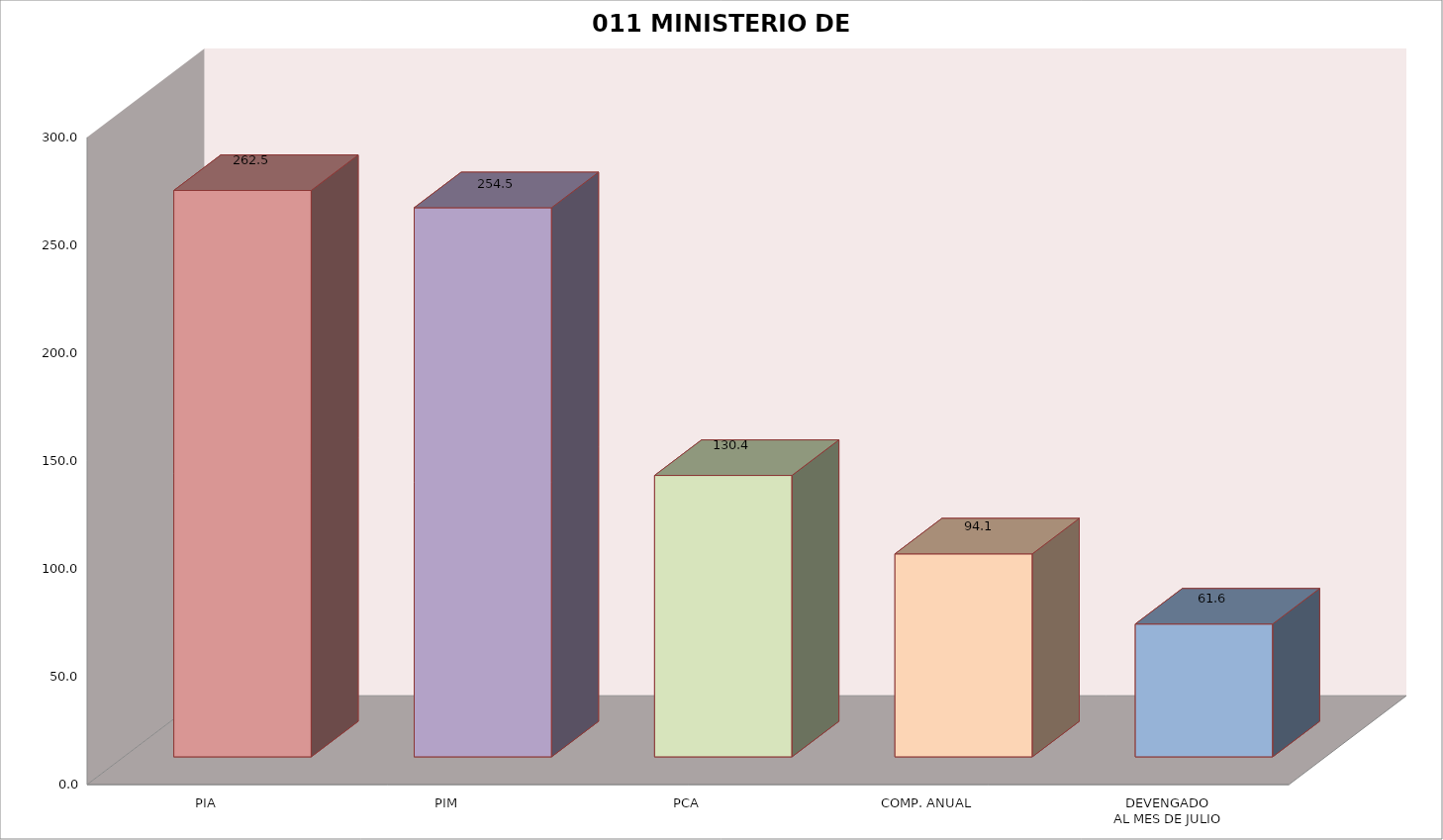
| Category | 011 MINISTERIO DE SALUD |
|---|---|
| PIA | 262.508 |
| PIM | 254.515 |
| PCA | 130.428 |
| COMP. ANUAL | 94.073 |
| DEVENGADO
AL MES DE JULIO | 61.553 |